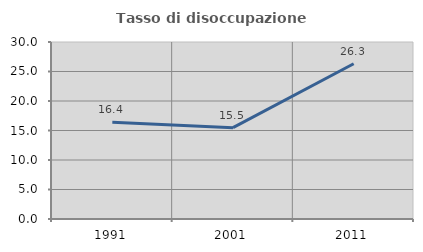
| Category | Tasso di disoccupazione giovanile  |
|---|---|
| 1991.0 | 16.406 |
| 2001.0 | 15.476 |
| 2011.0 | 26.316 |